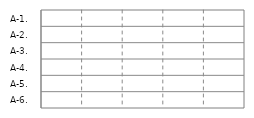
| Category | IN | OUT |
|---|---|---|
| A-1. | 0 | 0 |
| A-2. | 0 | 0 |
| A-3. | 0 | 0 |
| A-4. | 0 | 0 |
| A-5. | 0 | 0 |
| A-6. | 0 | 0 |